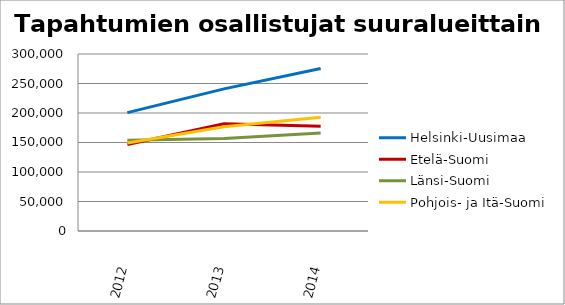
| Category | Helsinki-Uusimaa | Etelä-Suomi | Länsi-Suomi | Pohjois- ja Itä-Suomi |
|---|---|---|---|---|
| 2012.0 | 200588 | 146708 | 153875 | 149006 |
| 2013.0 | 240929 | 181736 | 156861 | 176802 |
| 2014.0 | 275370 | 177518 | 166202 | 192636 |